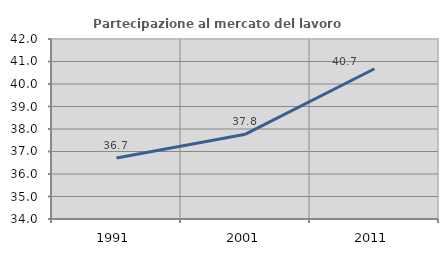
| Category | Partecipazione al mercato del lavoro  femminile |
|---|---|
| 1991.0 | 36.709 |
| 2001.0 | 37.77 |
| 2011.0 | 40.676 |